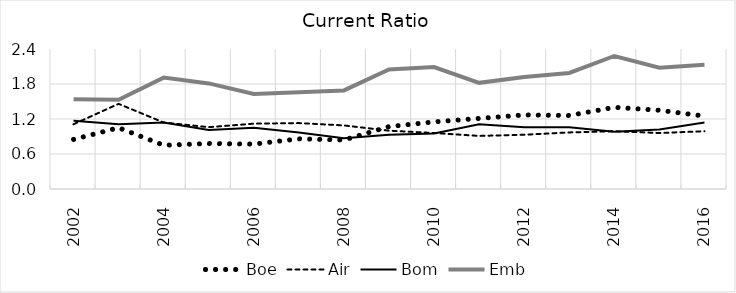
| Category | Boe | Air | Bom | Emb |
|---|---|---|---|---|
| 2002.0 | 0.85 | 1.11 | 1.17 | 1.54 |
| 2003.0 | 1.05 | 1.46 | 1.11 | 1.53 |
| 2004.0 | 0.75 | 1.14 | 1.14 | 1.91 |
| 2005.0 | 0.78 | 1.06 | 1.01 | 1.81 |
| 2006.0 | 0.77 | 1.12 | 1.05 | 1.63 |
| 2007.0 | 0.86 | 1.13 | 0.97 | 1.66 |
| 2008.0 | 0.84 | 1.09 | 0.87 | 1.69 |
| 2009.0 | 1.07 | 1 | 0.93 | 2.05 |
| 2010.0 | 1.15 | 0.96 | 0.95 | 2.09 |
| 2011.0 | 1.21 | 0.91 | 1.11 | 1.82 |
| 2012.0 | 1.27 | 0.93 | 1.06 | 1.92 |
| 2013.0 | 1.26 | 0.97 | 1.06 | 1.99 |
| 2014.0 | 1.4 | 0.99 | 0.98 | 2.28 |
| 2015.0 | 1.35 | 0.96 | 1.02 | 2.08 |
| 2016.0 | 1.25 | 0.99 | 1.14 | 2.13 |